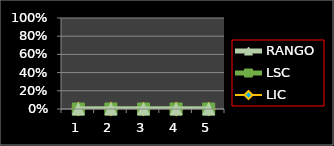
| Category | LIC | LSC | RANGO |
|---|---|---|---|
| 0 |  | 0 | 0 |
| 1 |  | 0 | 0 |
| 2 |  | 0 | 0 |
| 3 |  | 0 | 0 |
| 4 |  | 0 | 0 |